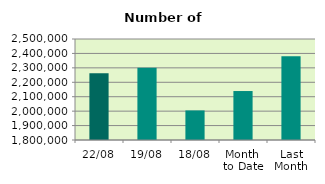
| Category | Series 0 |
|---|---|
| 22/08 | 2262324 |
| 19/08 | 2301034 |
| 18/08 | 2004990 |
| Month 
to Date | 2139399.5 |
| Last
Month | 2380266.19 |